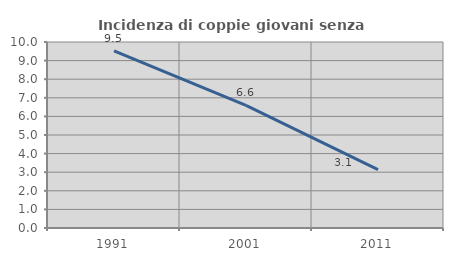
| Category | Incidenza di coppie giovani senza figli |
|---|---|
| 1991.0 | 9.524 |
| 2001.0 | 6.588 |
| 2011.0 | 3.139 |